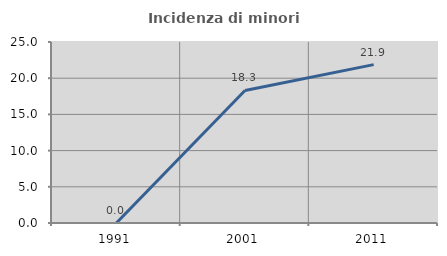
| Category | Incidenza di minori stranieri |
|---|---|
| 1991.0 | 0 |
| 2001.0 | 18.31 |
| 2011.0 | 21.875 |